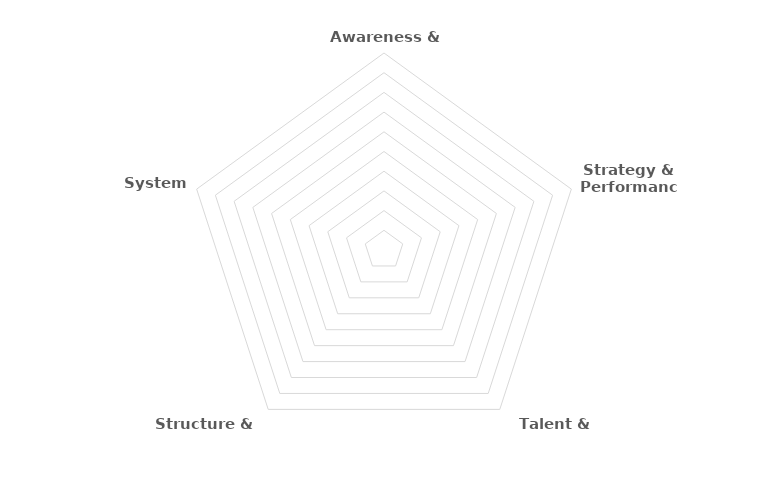
| Category | Series 0 |
|---|---|
| Awareness & Vision | 0 |
| Strategy & Performance | 0 |
| Talent & Culture | 0 |
| Structure & Process | 0 |
| Systems | 0 |